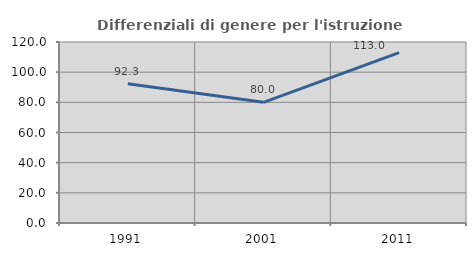
| Category | Differenziali di genere per l'istruzione superiore |
|---|---|
| 1991.0 | 92.267 |
| 2001.0 | 80.016 |
| 2011.0 | 112.963 |